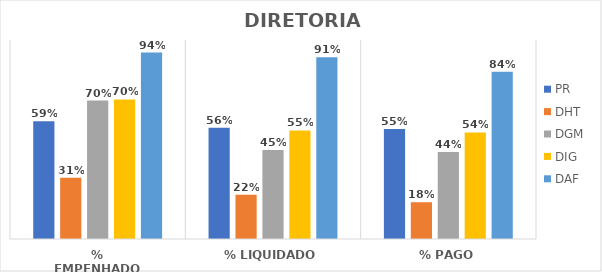
| Category | PR | DHT | DGM | DIG | DAF |
|---|---|---|---|---|---|
| % EMPENHADO | 0.592 | 0.308 | 0.695 | 0.702 | 0.937 |
| % LIQUIDADO | 0.559 | 0.223 | 0.447 | 0.545 | 0.914 |
| % PAGO | 0.553 | 0.185 | 0.437 | 0.536 | 0.84 |